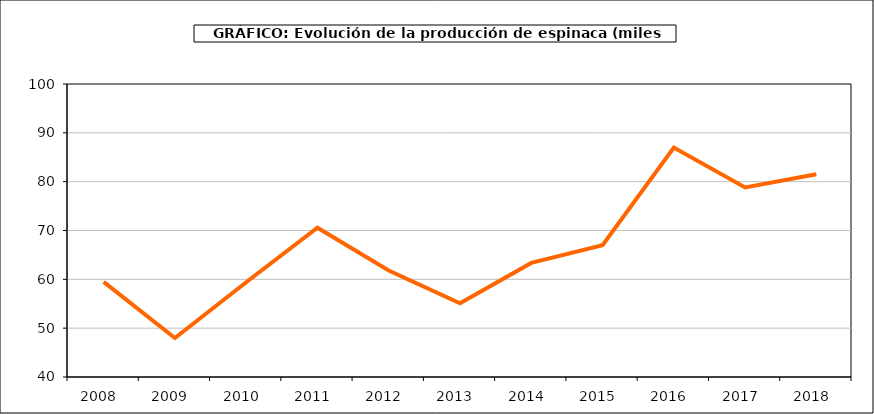
| Category | producción |
|---|---|
| 2008.0 | 59.476 |
| 2009.0 | 47.983 |
| 2010.0 | 59.403 |
| 2011.0 | 70.571 |
| 2012.0 | 61.814 |
| 2013.0 | 55.11 |
| 2014.0 | 63.364 |
| 2015.0 | 66.989 |
| 2016.0 | 86.99 |
| 2017.0 | 78.802 |
| 2018.0 | 81.53 |